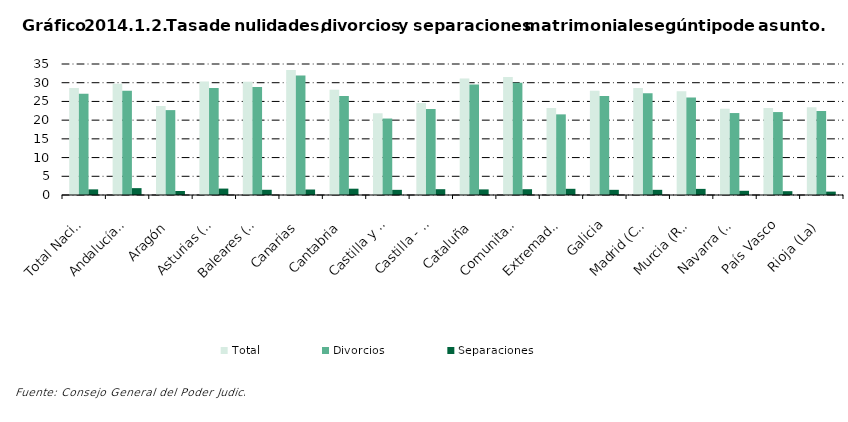
| Category | Total | Divorcios | Separaciones |
|---|---|---|---|
| Total Nacional | 28.574 | 27.025 | 1.505 |
| Andalucía(1) | 29.701 | 27.837 | 1.833 |
| Aragón | 23.789 | 22.68 | 1.071 |
| Asturias (Principado de) | 30.299 | 28.566 | 1.714 |
| Baleares (Illes) | 30.242 | 28.828 | 1.396 |
| Canarias | 33.39 | 31.908 | 1.463 |
| Cantabria | 28.115 | 26.433 | 1.682 |
| Castilla y León | 21.834 | 20.427 | 1.379 |
| Castilla - La Mancha | 24.555 | 22.987 | 1.549 |
| Cataluña | 31.157 | 29.538 | 1.496 |
| Comunitat Valenciana | 31.545 | 29.977 | 1.548 |
| Extremadura | 23.226 | 21.544 | 1.655 |
| Galicia | 27.839 | 26.449 | 1.382 |
| Madrid (Comunidad de) | 28.59 | 27.16 | 1.384 |
| Murcia (Región de) | 27.706 | 26.063 | 1.636 |
| Navarra (Comunidad Foral de) | 23.05 | 21.895 | 1.124 |
| País Vasco | 23.212 | 22.156 | 1.019 |
| Rioja (La) | 23.417 | 22.445 | 0.909 |